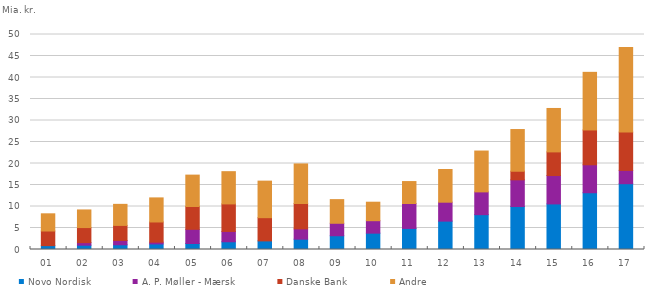
| Category | Novo Nordisk | A. P. Møller - Mærsk | Danske Bank | Andre |
|---|---|---|---|---|
| 01 | 0.9 | 0 | 3.4 | 4 |
| 02 | 1 | 0.6 | 3.5 | 4.1 |
| 03 | 1.1 | 1 | 3.5 | 4.9 |
| 04 | 1.3 | 0.4 | 4.7 | 5.6 |
| 05 | 1.4 | 3.3 | 5.3 | 7.3 |
| 06 | 1.8 | 2.4 | 6.4 | 7.5 |
| 07 | 2 | 0 | 5.4 | 8.5 |
| 08 | 2.4 | 2.4 | 5.9 | 9.2 |
| 09 | 3.2 | 2.9 | 0 | 5.5 |
| 10 | 3.8 | 2.9 | 0 | 4.3 |
| 11 | 4.9 | 5.8 | 0 | 5.1 |
| 12 | 6.6 | 4.4 | 0 | 7.6 |
| 13 | 8.1 | 5.3 | 0 | 9.5 |
| 14 | 10 | 6.2 | 2 | 9.7 |
| 15 | 10.6 | 6.6 | 5.5 | 10.1 |
| 16 | 13.2 | 6.5 | 8.1 | 13.4 |
| 17 | 15.3 | 3.1 | 8.9 | 19.7 |